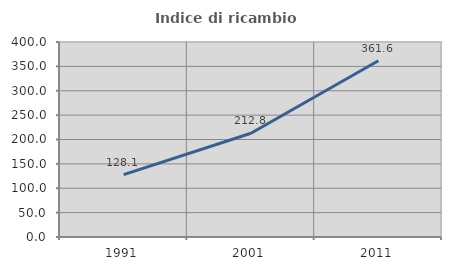
| Category | Indice di ricambio occupazionale  |
|---|---|
| 1991.0 | 128.09 |
| 2001.0 | 212.821 |
| 2011.0 | 361.644 |